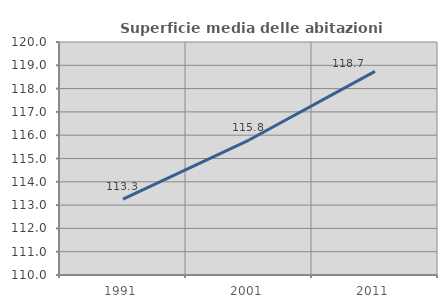
| Category | Superficie media delle abitazioni occupate |
|---|---|
| 1991.0 | 113.258 |
| 2001.0 | 115.793 |
| 2011.0 | 118.737 |